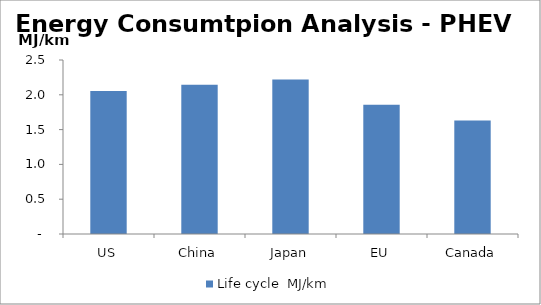
| Category | Life cycle  |
|---|---|
| US | 2.056 |
| China | 2.145 |
| Japan | 2.219 |
| EU | 1.858 |
| Canada | 1.63 |